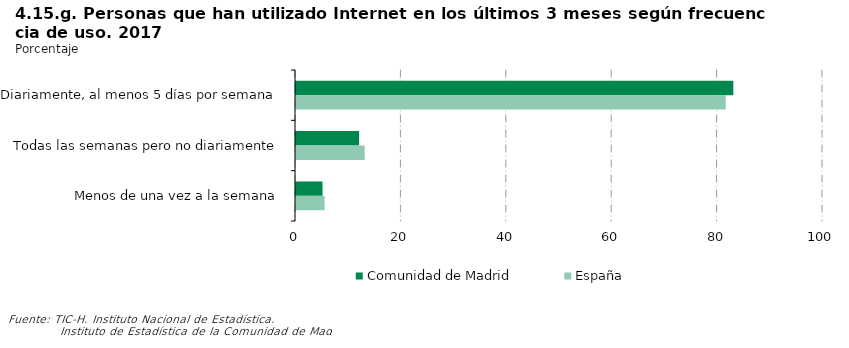
| Category | Comunidad de Madrid | España |
|---|---|---|
| Diariamente, al menos 5 días por semana | 82.985 | 81.536 |
| Todas las semanas pero no diariamente | 11.981 | 13.038 |
| Menos de una vez a la semana | 5.035 | 5.426 |